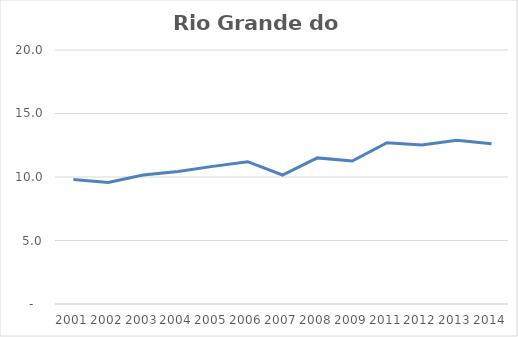
| Category | Total |
|---|---|
| 2001.0 | 9.797 |
| 2002.0 | 9.569 |
| 2003.0 | 10.155 |
| 2004.0 | 10.439 |
| 2005.0 | 10.837 |
| 2006.0 | 11.206 |
| 2007.0 | 10.157 |
| 2008.0 | 11.504 |
| 2009.0 | 11.259 |
| 2011.0 | 12.698 |
| 2012.0 | 12.522 |
| 2013.0 | 12.885 |
| 2014.0 | 12.614 |